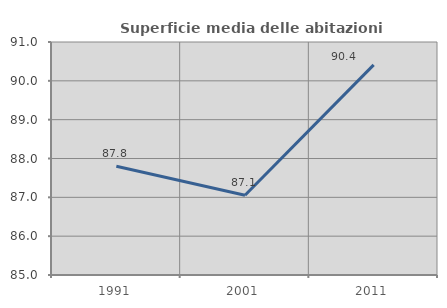
| Category | Superficie media delle abitazioni occupate |
|---|---|
| 1991.0 | 87.798 |
| 2001.0 | 87.053 |
| 2011.0 | 90.412 |